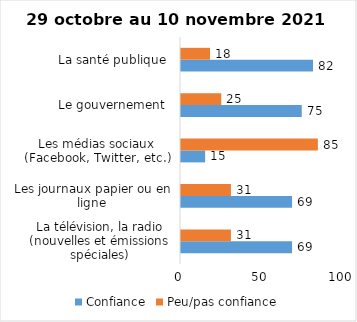
| Category | Confiance | Peu/pas confiance |
|---|---|---|
| La télévision, la radio (nouvelles et émissions spéciales) | 69 | 31 |
| Les journaux papier ou en ligne | 69 | 31 |
| Les médias sociaux (Facebook, Twitter, etc.) | 15 | 85 |
| Le gouvernement  | 75 | 25 |
| La santé publique  | 82 | 18 |